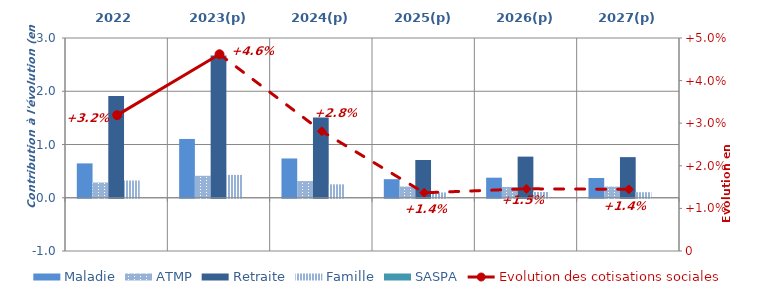
| Category | Maladie | ATMP | Retraite | Famille | SASPA |
|---|---|---|---|---|---|
| 2022 | 0.645 | 0.286 | 1.909 | 0.324 | 0 |
| 2023(p) | 1.104 | 0.413 | 2.672 | 0.429 | 0 |
| 2024(p) | 0.738 | 0.314 | 1.505 | 0.252 | 0 |
| 2025(p) | 0.349 | 0.21 | 0.709 | 0.099 | 0 |
| 2026(p) | 0.377 | 0.202 | 0.772 | 0.108 | 0 |
| 2027(p) | 0.371 | 0.209 | 0.763 | 0.104 | 0 |